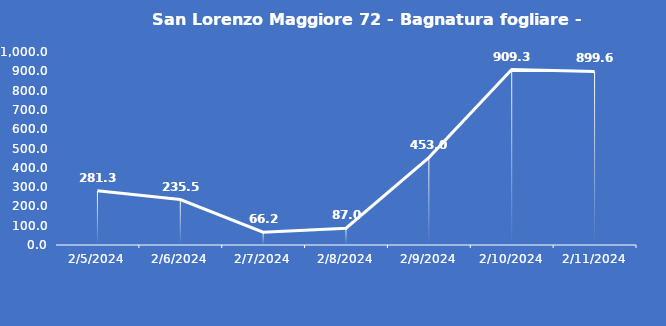
| Category | San Lorenzo Maggiore 72 - Bagnatura fogliare - Grezzo (min) |
|---|---|
| 2/5/24 | 281.3 |
| 2/6/24 | 235.5 |
| 2/7/24 | 66.2 |
| 2/8/24 | 87 |
| 2/9/24 | 453 |
| 2/10/24 | 909.3 |
| 2/11/24 | 899.6 |